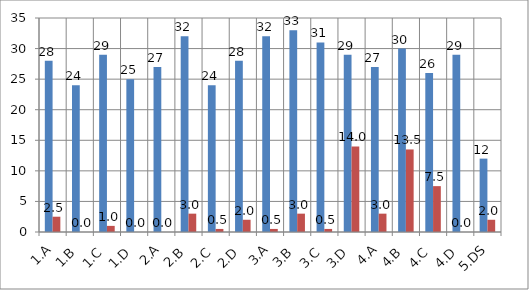
| Category | Series 0 | Series 1 |
|---|---|---|
| 1.A | 28 | 2.5 |
| 1.B | 24 | 0 |
| 1.C | 29 | 1 |
| 1.D | 25 | 0 |
| 2.A | 27 | 0 |
| 2.B | 32 | 3 |
| 2.C | 24 | 0.5 |
| 2.D | 28 | 2 |
| 3.A | 32 | 0.5 |
| 3.B | 33 | 3 |
| 3.C | 31 | 0.5 |
| 3.D | 29 | 14 |
| 4.A | 27 | 3 |
| 4.B | 30 | 13.5 |
| 4.C | 26 | 7.5 |
| 4.D | 29 | 0 |
| 5.DS | 12 | 2 |